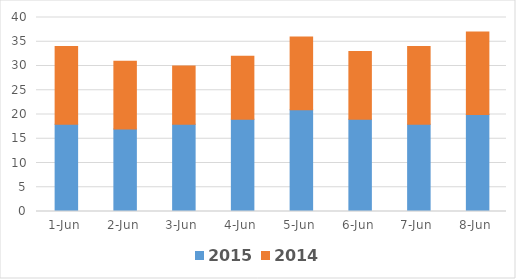
| Category | 2015 | 2014 |
|---|---|---|
| 2015-06-01 | 18 | 16 |
| 2015-06-02 | 17 | 14 |
| 2015-06-03 | 18 | 12 |
| 2015-06-04 | 19 | 13 |
| 2015-06-05 | 21 | 15 |
| 2015-06-06 | 19 | 14 |
| 2015-06-07 | 18 | 16 |
| 2015-06-08 | 20 | 17 |